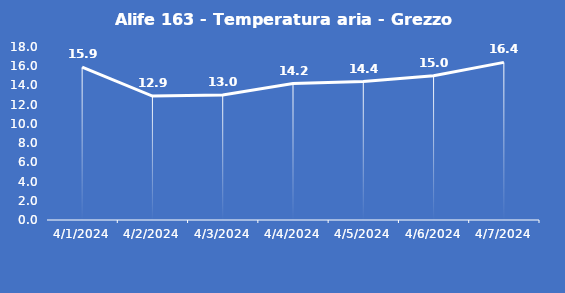
| Category | Alife 163 - Temperatura aria - Grezzo (°C) |
|---|---|
| 4/1/24 | 15.9 |
| 4/2/24 | 12.9 |
| 4/3/24 | 13 |
| 4/4/24 | 14.2 |
| 4/5/24 | 14.4 |
| 4/6/24 | 15 |
| 4/7/24 | 16.4 |